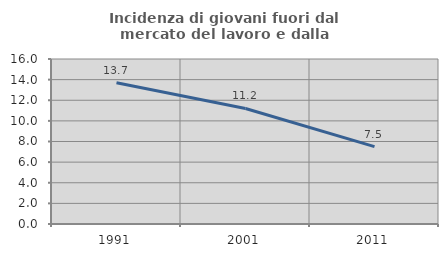
| Category | Incidenza di giovani fuori dal mercato del lavoro e dalla formazione  |
|---|---|
| 1991.0 | 13.692 |
| 2001.0 | 11.203 |
| 2011.0 | 7.5 |